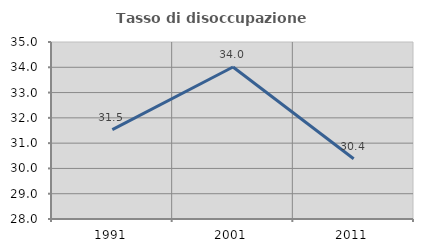
| Category | Tasso di disoccupazione giovanile  |
|---|---|
| 1991.0 | 31.536 |
| 2001.0 | 34.012 |
| 2011.0 | 30.382 |